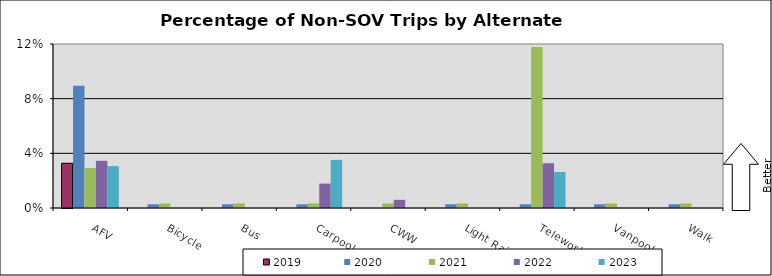
| Category | 2019 | 2020 | 2021 | 2022 | 2023 |
|---|---|---|---|---|---|
| AFV | 0.033 | 0.089 | 0.029 | 0.035 | 0.031 |
| Bicycle | 0 | 0.003 | 0.003 | 0 | 0 |
| Bus | 0 | 0.003 | 0.003 | 0 | 0 |
| Carpool | 0 | 0.003 | 0.003 | 0.018 | 0.035 |
| CWW | 0 | 0 | 0.003 | 0.006 | 0 |
| Light Rail | 0 | 0.003 | 0.003 | 0 | 0 |
| Telework | 0 | 0.003 | 0.118 | 0.033 | 0.026 |
| Vanpool | 0 | 0.003 | 0.003 | 0 | 0 |
| Walk | 0 | 0.003 | 0.003 | 0 | 0 |